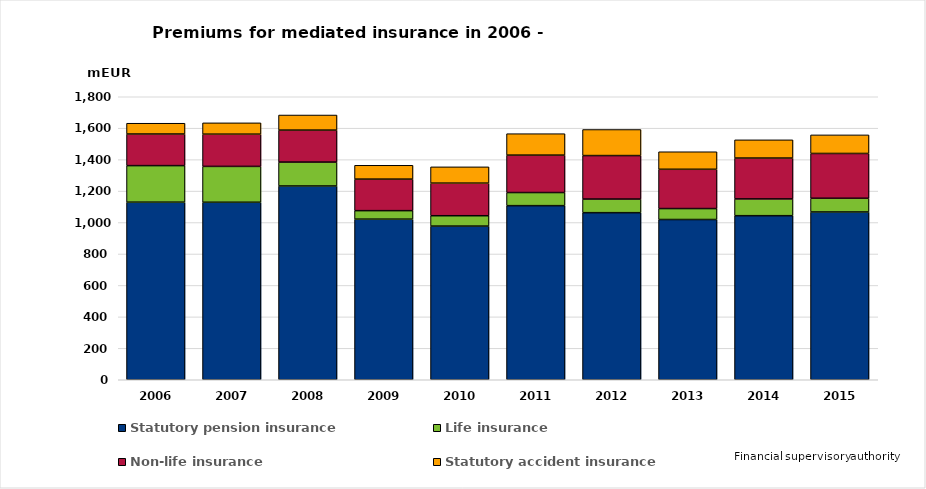
| Category | Statutory pension insurance | Life insurance | Non-life insurance | Statutory accident insurance |
|---|---|---|---|---|
| 2006.0 | 1129.49 | 232.47 | 201.056 | 68.612 |
| 2007.0 | 1129 | 228 | 205 | 72 |
| 2008.0 | 1232.449 | 151.996 | 203.425 | 95.962 |
| 2009.0 | 1021.457 | 54.107 | 200.56 | 88.041 |
| 2010.0 | 977.321 | 65.95 | 207.341 | 103.558 |
| 2011.0 | 1107.329 | 83.403 | 238.041 | 136.289 |
| 2012.0 | 1062.705 | 86.597 | 276.62 | 165.706 |
| 2013.0 | 1019.216 | 69.648 | 249.823 | 111.515 |
| 2014.0 | 1043.573 | 106.619 | 259.835 | 115.957 |
| 2015.0 | 1067.062 | 87.285 | 284.943 | 118.153 |